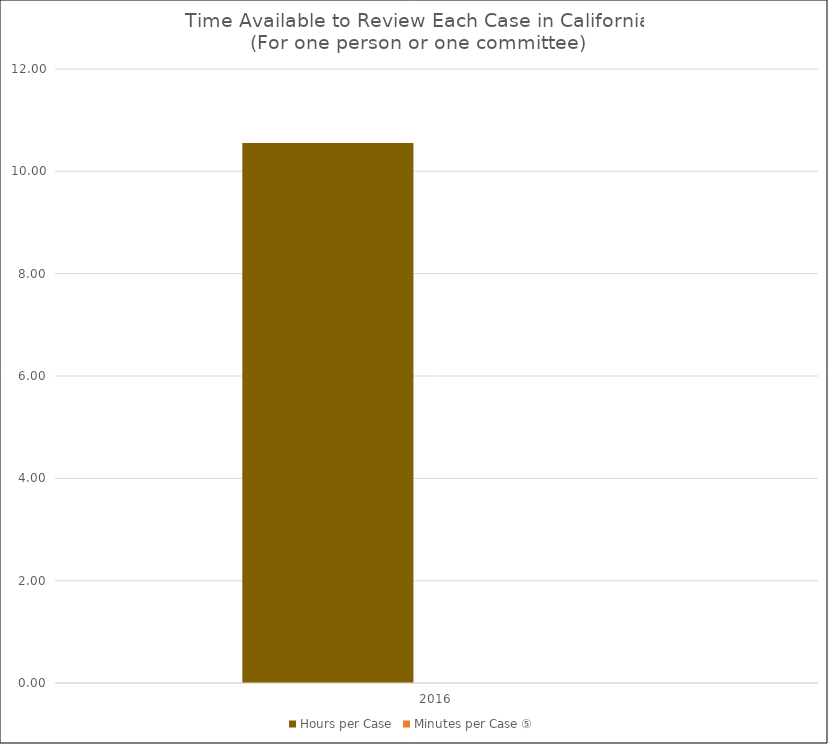
| Category | Hours per Case | Minutes per Case ⑤ |
|---|---|---|
| 2016.0 | 10.553 |  |